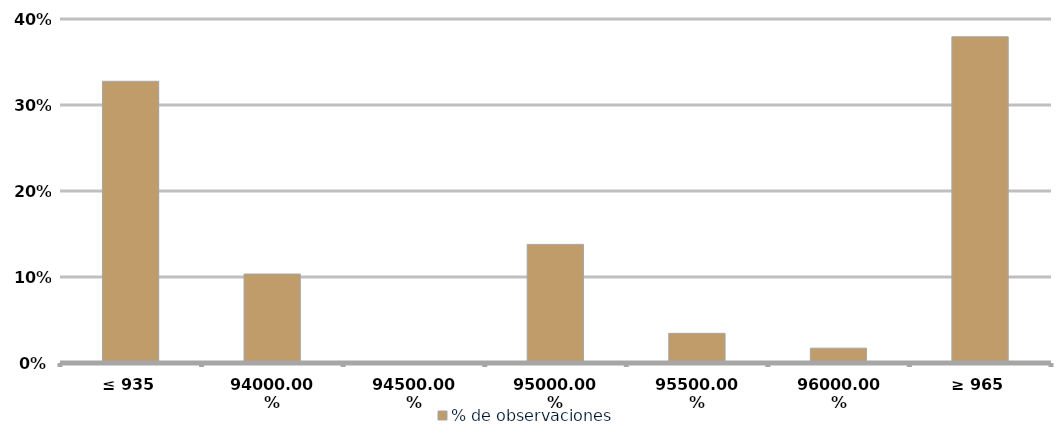
| Category | % de observaciones  |
|---|---|
| ≤ 935 | 0.328 |
| 940 | 0.103 |
| 945 | 0 |
| 950 | 0.138 |
| 955 | 0.034 |
| 960 | 0.017 |
| ≥ 965 | 0.379 |